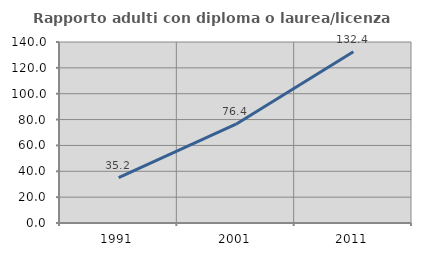
| Category | Rapporto adulti con diploma o laurea/licenza media  |
|---|---|
| 1991.0 | 35.163 |
| 2001.0 | 76.403 |
| 2011.0 | 132.429 |